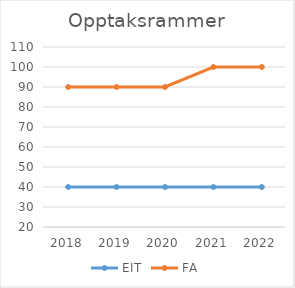
| Category | EIT | FA |
|---|---|---|
| 2018 | 40 | 90 |
| 2019 | 40 | 90 |
| 2020 | 40 | 90 |
| 2021 | 40 | 100 |
| 2022 | 40 | 100 |